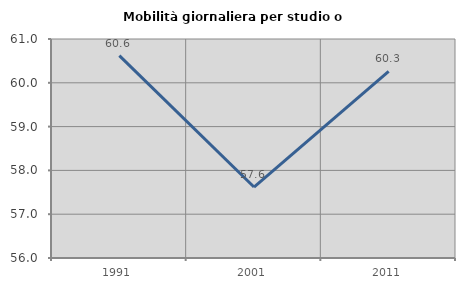
| Category | Mobilità giornaliera per studio o lavoro |
|---|---|
| 1991.0 | 60.621 |
| 2001.0 | 57.62 |
| 2011.0 | 60.259 |